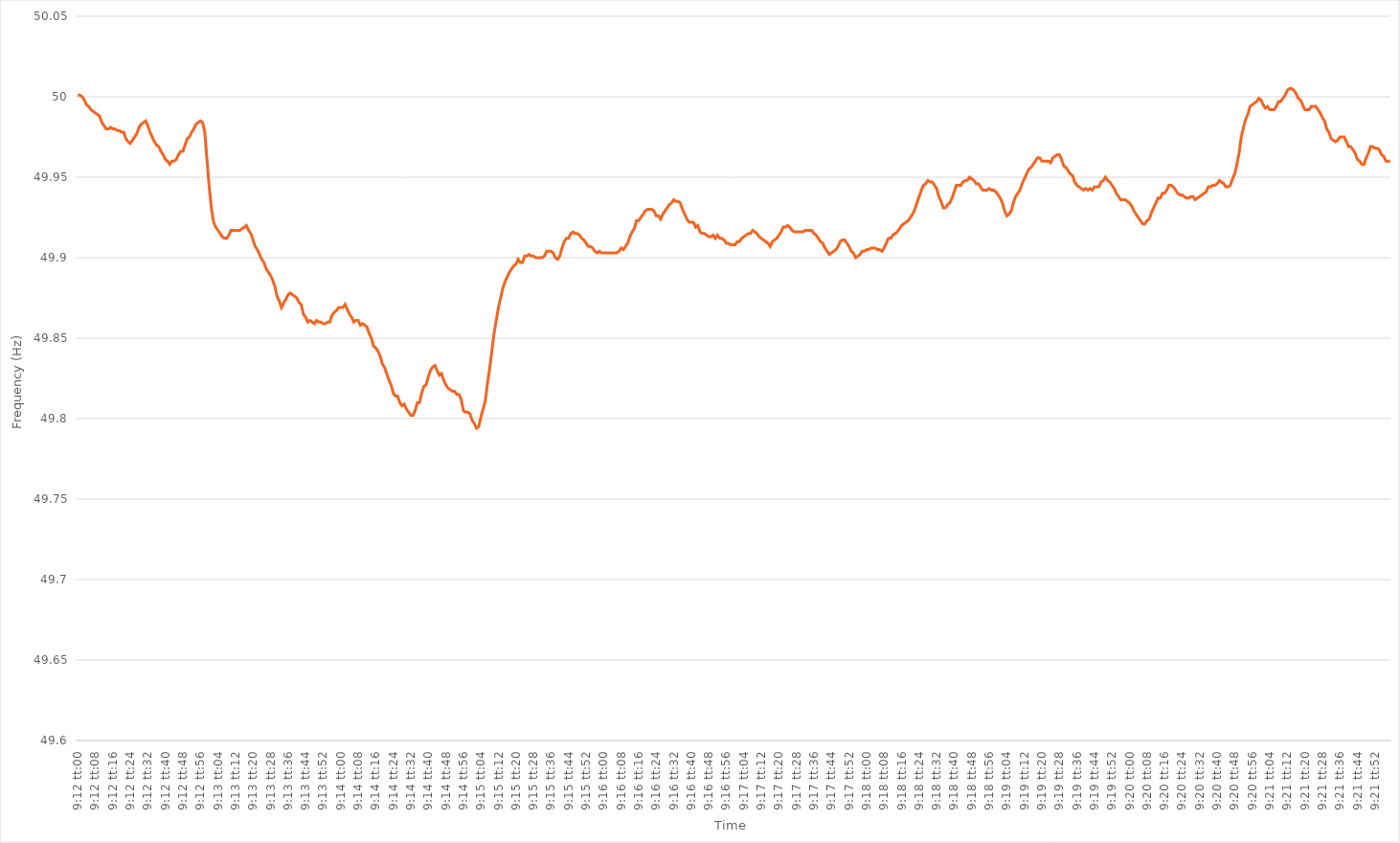
| Category | Series 0 |
|---|---|
| 0.3833333333333333 | 50.001 |
| 0.3833449074074074 | 50.001 |
| 0.38335648148148144 | 50 |
| 0.3833680555555556 | 49.998 |
| 0.3833796296296296 | 49.995 |
| 0.3833912037037037 | 49.994 |
| 0.38340277777777776 | 49.992 |
| 0.38341435185185185 | 49.991 |
| 0.3834259259259259 | 49.99 |
| 0.38343750000000004 | 49.989 |
| 0.3834490740740741 | 49.988 |
| 0.3834606481481482 | 49.984 |
| 0.3834722222222222 | 49.982 |
| 0.3834837962962963 | 49.98 |
| 0.38349537037037035 | 49.98 |
| 0.3835069444444445 | 49.981 |
| 0.38351851851851854 | 49.98 |
| 0.3835300925925926 | 49.98 |
| 0.38354166666666667 | 49.979 |
| 0.3835532407407407 | 49.979 |
| 0.3835648148148148 | 49.978 |
| 0.38357638888888884 | 49.978 |
| 0.383587962962963 | 49.974 |
| 0.38359953703703703 | 49.972 |
| 0.3836111111111111 | 49.971 |
| 0.38362268518518516 | 49.973 |
| 0.38363425925925926 | 49.975 |
| 0.3836458333333333 | 49.977 |
| 0.38365740740740745 | 49.981 |
| 0.3836689814814815 | 49.983 |
| 0.3836805555555556 | 49.984 |
| 0.3836921296296296 | 49.985 |
| 0.3837037037037037 | 49.982 |
| 0.38371527777777775 | 49.978 |
| 0.3837268518518519 | 49.975 |
| 0.38373842592592594 | 49.972 |
| 0.38375000000000004 | 49.97 |
| 0.3837615740740741 | 49.969 |
| 0.3837731481481481 | 49.966 |
| 0.3837847222222222 | 49.964 |
| 0.38379629629629625 | 49.961 |
| 0.3838078703703704 | 49.96 |
| 0.38381944444444444 | 49.958 |
| 0.38383101851851853 | 49.96 |
| 0.38384259259259257 | 49.96 |
| 0.38385416666666666 | 49.961 |
| 0.3838657407407407 | 49.964 |
| 0.38387731481481485 | 49.966 |
| 0.3838888888888889 | 49.966 |
| 0.383900462962963 | 49.97 |
| 0.383912037037037 | 49.974 |
| 0.3839236111111111 | 49.975 |
| 0.38393518518518516 | 49.978 |
| 0.3839467592592593 | 49.98 |
| 0.38395833333333335 | 49.983 |
| 0.38396990740740744 | 49.984 |
| 0.3839814814814815 | 49.985 |
| 0.3839930555555555 | 49.984 |
| 0.3840046296296296 | 49.978 |
| 0.38401620370370365 | 49.961 |
| 0.3840277777777778 | 49.944 |
| 0.38403935185185184 | 49.931 |
| 0.38405092592592593 | 49.922 |
| 0.3840625 | 49.919 |
| 0.38407407407407407 | 49.917 |
| 0.3840856481481481 | 49.915 |
| 0.38409722222222226 | 49.913 |
| 0.3841087962962963 | 49.912 |
| 0.3841203703703704 | 49.912 |
| 0.38413194444444443 | 49.914 |
| 0.3841435185185185 | 49.917 |
| 0.38415509259259256 | 49.917 |
| 0.3841666666666667 | 49.917 |
| 0.38417824074074075 | 49.917 |
| 0.38418981481481485 | 49.917 |
| 0.3842013888888889 | 49.918 |
| 0.384212962962963 | 49.919 |
| 0.384224537037037 | 49.92 |
| 0.38423611111111117 | 49.917 |
| 0.3842476851851852 | 49.915 |
| 0.38425925925925924 | 49.911 |
| 0.38427083333333334 | 49.907 |
| 0.3842824074074074 | 49.905 |
| 0.3842939814814815 | 49.902 |
| 0.3843055555555555 | 49.899 |
| 0.38431712962962966 | 49.897 |
| 0.3843287037037037 | 49.893 |
| 0.3843402777777778 | 49.891 |
| 0.38435185185185183 | 49.889 |
| 0.38436342592592593 | 49.886 |
| 0.38437499999999997 | 49.882 |
| 0.3843865740740741 | 49.876 |
| 0.38439814814814816 | 49.873 |
| 0.38440972222222225 | 49.869 |
| 0.3844212962962963 | 49.872 |
| 0.3844328703703704 | 49.874 |
| 0.3844444444444444 | 49.877 |
| 0.38445601851851857 | 49.878 |
| 0.3844675925925926 | 49.877 |
| 0.38447916666666665 | 49.876 |
| 0.38449074074074074 | 49.875 |
| 0.3845023148148148 | 49.872 |
| 0.3845138888888889 | 49.871 |
| 0.3845254629629629 | 49.865 |
| 0.38453703703703707 | 49.863 |
| 0.3845486111111111 | 49.86 |
| 0.3845601851851852 | 49.861 |
| 0.38457175925925924 | 49.86 |
| 0.38458333333333333 | 49.859 |
| 0.38459490740740737 | 49.861 |
| 0.3846064814814815 | 49.86 |
| 0.38461805555555556 | 49.86 |
| 0.38462962962962965 | 49.859 |
| 0.3846412037037037 | 49.859 |
| 0.3846527777777778 | 49.86 |
| 0.3846643518518518 | 49.86 |
| 0.384675925925926 | 49.864 |
| 0.3846875 | 49.866 |
| 0.3846990740740741 | 49.867 |
| 0.38471064814814815 | 49.869 |
| 0.3847222222222222 | 49.869 |
| 0.3847337962962963 | 49.869 |
| 0.3847453703703703 | 49.871 |
| 0.38475694444444447 | 49.868 |
| 0.3847685185185185 | 49.865 |
| 0.3847800925925926 | 49.863 |
| 0.38479166666666664 | 49.86 |
| 0.38480324074074074 | 49.861 |
| 0.3848148148148148 | 49.861 |
| 0.3848263888888889 | 49.858 |
| 0.38483796296296297 | 49.859 |
| 0.38484953703703706 | 49.858 |
| 0.3848611111111111 | 49.857 |
| 0.3848726851851852 | 49.853 |
| 0.38488425925925923 | 49.85 |
| 0.3848958333333334 | 49.845 |
| 0.3849074074074074 | 49.844 |
| 0.3849189814814815 | 49.842 |
| 0.38493055555555555 | 49.839 |
| 0.38494212962962965 | 49.834 |
| 0.3849537037037037 | 49.832 |
| 0.3849652777777777 | 49.828 |
| 0.3849768518518519 | 49.824 |
| 0.3849884259259259 | 49.821 |
| 0.385 | 49.816 |
| 0.38501157407407405 | 49.814 |
| 0.38502314814814814 | 49.814 |
| 0.3850347222222222 | 49.81 |
| 0.38504629629629633 | 49.808 |
| 0.38505787037037037 | 49.809 |
| 0.38506944444444446 | 49.806 |
| 0.3850810185185185 | 49.804 |
| 0.3850925925925926 | 49.802 |
| 0.38510416666666664 | 49.802 |
| 0.3851157407407408 | 49.805 |
| 0.3851273148148148 | 49.81 |
| 0.3851388888888889 | 49.81 |
| 0.38515046296296296 | 49.816 |
| 0.38516203703703705 | 49.82 |
| 0.3851736111111111 | 49.821 |
| 0.38518518518518513 | 49.826 |
| 0.3851967592592593 | 49.83 |
| 0.3852083333333333 | 49.832 |
| 0.3852199074074074 | 49.833 |
| 0.38523148148148145 | 49.83 |
| 0.38524305555555555 | 49.827 |
| 0.3852546296296296 | 49.828 |
| 0.38526620370370374 | 49.824 |
| 0.3852777777777778 | 49.821 |
| 0.38528935185185187 | 49.819 |
| 0.3853009259259259 | 49.818 |
| 0.3853125 | 49.817 |
| 0.38532407407407404 | 49.817 |
| 0.3853356481481482 | 49.815 |
| 0.38534722222222223 | 49.815 |
| 0.3853587962962963 | 49.812 |
| 0.38537037037037036 | 49.805 |
| 0.38538194444444446 | 49.804 |
| 0.3853935185185185 | 49.804 |
| 0.38540509259259265 | 49.803 |
| 0.3854166666666667 | 49.799 |
| 0.3854282407407407 | 49.797 |
| 0.3854398148148148 | 49.794 |
| 0.38545138888888886 | 49.795 |
| 0.38546296296296295 | 49.801 |
| 0.385474537037037 | 49.806 |
| 0.38548611111111114 | 49.811 |
| 0.3854976851851852 | 49.822 |
| 0.3855092592592593 | 49.831 |
| 0.3855208333333333 | 49.842 |
| 0.3855324074074074 | 49.853 |
| 0.38554398148148145 | 49.861 |
| 0.3855555555555556 | 49.869 |
| 0.38556712962962963 | 49.875 |
| 0.38557870370370373 | 49.881 |
| 0.38559027777777777 | 49.885 |
| 0.38560185185185186 | 49.888 |
| 0.3856134259259259 | 49.891 |
| 0.38562500000000005 | 49.893 |
| 0.3856365740740741 | 49.895 |
| 0.3856481481481482 | 49.896 |
| 0.3856597222222222 | 49.899 |
| 0.38567129629629626 | 49.897 |
| 0.38568287037037036 | 49.897 |
| 0.3856944444444444 | 49.901 |
| 0.38570601851851855 | 49.901 |
| 0.3857175925925926 | 49.902 |
| 0.3857291666666667 | 49.901 |
| 0.3857407407407407 | 49.901 |
| 0.3857523148148148 | 49.9 |
| 0.38576388888888885 | 49.9 |
| 0.385775462962963 | 49.9 |
| 0.38578703703703704 | 49.9 |
| 0.38579861111111113 | 49.901 |
| 0.3858101851851852 | 49.904 |
| 0.38582175925925927 | 49.904 |
| 0.3858333333333333 | 49.904 |
| 0.38584490740740746 | 49.903 |
| 0.3858564814814815 | 49.9 |
| 0.3858680555555556 | 49.899 |
| 0.38587962962962963 | 49.901 |
| 0.38589120370370367 | 49.906 |
| 0.38590277777777776 | 49.91 |
| 0.3859143518518518 | 49.912 |
| 0.38592592592592595 | 49.912 |
| 0.3859375 | 49.915 |
| 0.3859490740740741 | 49.916 |
| 0.3859606481481481 | 49.915 |
| 0.3859722222222222 | 49.915 |
| 0.38598379629629626 | 49.914 |
| 0.3859953703703704 | 49.912 |
| 0.38600694444444444 | 49.911 |
| 0.38601851851851854 | 49.909 |
| 0.3860300925925926 | 49.907 |
| 0.38604166666666667 | 49.907 |
| 0.3860532407407407 | 49.906 |
| 0.38606481481481486 | 49.904 |
| 0.3860763888888889 | 49.903 |
| 0.386087962962963 | 49.904 |
| 0.38609953703703703 | 49.903 |
| 0.3861111111111111 | 49.903 |
| 0.38612268518518517 | 49.903 |
| 0.3861342592592593 | 49.903 |
| 0.38614583333333335 | 49.903 |
| 0.3861574074074074 | 49.903 |
| 0.3861689814814815 | 49.903 |
| 0.3861805555555555 | 49.903 |
| 0.3861921296296296 | 49.904 |
| 0.38620370370370366 | 49.906 |
| 0.3862152777777778 | 49.905 |
| 0.38622685185185185 | 49.907 |
| 0.38623842592592594 | 49.909 |
| 0.38625 | 49.913 |
| 0.3862615740740741 | 49.916 |
| 0.3862731481481481 | 49.918 |
| 0.38628472222222227 | 49.923 |
| 0.3862962962962963 | 49.923 |
| 0.3863078703703704 | 49.925 |
| 0.38631944444444444 | 49.927 |
| 0.38633101851851853 | 49.929 |
| 0.38634259259259257 | 49.93 |
| 0.3863541666666667 | 49.93 |
| 0.38636574074074076 | 49.93 |
| 0.3863773148148148 | 49.929 |
| 0.3863888888888889 | 49.926 |
| 0.38640046296296293 | 49.926 |
| 0.386412037037037 | 49.924 |
| 0.38642361111111106 | 49.927 |
| 0.3864351851851852 | 49.929 |
| 0.38644675925925925 | 49.931 |
| 0.38645833333333335 | 49.933 |
| 0.3864699074074074 | 49.934 |
| 0.3864814814814815 | 49.936 |
| 0.3864930555555555 | 49.935 |
| 0.38650462962962967 | 49.935 |
| 0.3865162037037037 | 49.934 |
| 0.3865277777777778 | 49.93 |
| 0.38653935185185184 | 49.927 |
| 0.38655092592592594 | 49.924 |
| 0.3865625 | 49.922 |
| 0.3865740740740741 | 49.922 |
| 0.38658564814814816 | 49.922 |
| 0.3865972222222222 | 49.919 |
| 0.3866087962962963 | 49.92 |
| 0.38662037037037034 | 49.916 |
| 0.38663194444444443 | 49.915 |
| 0.38664351851851847 | 49.915 |
| 0.3866550925925926 | 49.914 |
| 0.38666666666666666 | 49.913 |
| 0.38667824074074075 | 49.913 |
| 0.3866898148148148 | 49.914 |
| 0.3867013888888889 | 49.912 |
| 0.3867129629629629 | 49.914 |
| 0.3867245370370371 | 49.912 |
| 0.3867361111111111 | 49.912 |
| 0.3867476851851852 | 49.911 |
| 0.38675925925925925 | 49.909 |
| 0.38677083333333334 | 49.909 |
| 0.3867824074074074 | 49.908 |
| 0.38679398148148153 | 49.908 |
| 0.38680555555555557 | 49.908 |
| 0.38681712962962966 | 49.91 |
| 0.3868287037037037 | 49.91 |
| 0.3868402777777778 | 49.912 |
| 0.38685185185185184 | 49.913 |
| 0.3868634259259259 | 49.914 |
| 0.386875 | 49.915 |
| 0.38688657407407406 | 49.915 |
| 0.38689814814814816 | 49.917 |
| 0.3869097222222222 | 49.916 |
| 0.3869212962962963 | 49.915 |
| 0.38693287037037033 | 49.913 |
| 0.3869444444444445 | 49.912 |
| 0.3869560185185185 | 49.911 |
| 0.3869675925925926 | 49.91 |
| 0.38697916666666665 | 49.909 |
| 0.38699074074074075 | 49.907 |
| 0.3870023148148148 | 49.91 |
| 0.38701388888888894 | 49.911 |
| 0.387025462962963 | 49.912 |
| 0.38703703703703707 | 49.914 |
| 0.3870486111111111 | 49.916 |
| 0.3870601851851852 | 49.919 |
| 0.38707175925925924 | 49.919 |
| 0.3870833333333333 | 49.92 |
| 0.38709490740740743 | 49.919 |
| 0.38710648148148147 | 49.917 |
| 0.38711805555555556 | 49.916 |
| 0.3871296296296296 | 49.916 |
| 0.3871412037037037 | 49.916 |
| 0.38715277777777773 | 49.916 |
| 0.3871643518518519 | 49.916 |
| 0.3871759259259259 | 49.917 |
| 0.3871875 | 49.917 |
| 0.38719907407407406 | 49.917 |
| 0.38721064814814815 | 49.917 |
| 0.3872222222222222 | 49.915 |
| 0.38723379629629634 | 49.914 |
| 0.3872453703703704 | 49.912 |
| 0.3872569444444445 | 49.91 |
| 0.3872685185185185 | 49.909 |
| 0.3872800925925926 | 49.906 |
| 0.38729166666666665 | 49.904 |
| 0.3873032407407407 | 49.902 |
| 0.38731481481481483 | 49.903 |
| 0.3873263888888889 | 49.904 |
| 0.38733796296296297 | 49.905 |
| 0.387349537037037 | 49.907 |
| 0.3873611111111111 | 49.91 |
| 0.38737268518518514 | 49.911 |
| 0.3873842592592593 | 49.911 |
| 0.38739583333333333 | 49.909 |
| 0.3874074074074074 | 49.907 |
| 0.38741898148148146 | 49.904 |
| 0.38743055555555556 | 49.903 |
| 0.3874421296296296 | 49.9 |
| 0.38745370370370374 | 49.901 |
| 0.3874652777777778 | 49.902 |
| 0.3874768518518519 | 49.904 |
| 0.3874884259259259 | 49.904 |
| 0.3875 | 49.905 |
| 0.38751157407407405 | 49.905 |
| 0.3875231481481482 | 49.906 |
| 0.38753472222222224 | 49.906 |
| 0.38754629629629633 | 49.906 |
| 0.38755787037037037 | 49.905 |
| 0.3875694444444444 | 49.905 |
| 0.3875810185185185 | 49.904 |
| 0.38759259259259254 | 49.906 |
| 0.3876041666666667 | 49.909 |
| 0.38761574074074073 | 49.912 |
| 0.3876273148148148 | 49.912 |
| 0.38763888888888887 | 49.914 |
| 0.38765046296296296 | 49.915 |
| 0.387662037037037 | 49.916 |
| 0.38767361111111115 | 49.918 |
| 0.3876851851851852 | 49.92 |
| 0.3876967592592593 | 49.921 |
| 0.3877083333333333 | 49.922 |
| 0.3877199074074074 | 49.923 |
| 0.38773148148148145 | 49.925 |
| 0.3877430555555556 | 49.927 |
| 0.38775462962962964 | 49.93 |
| 0.38776620370370374 | 49.934 |
| 0.3877777777777778 | 49.938 |
| 0.3877893518518518 | 49.942 |
| 0.3878009259259259 | 49.945 |
| 0.38781249999999995 | 49.946 |
| 0.3878240740740741 | 49.948 |
| 0.38783564814814814 | 49.947 |
| 0.38784722222222223 | 49.947 |
| 0.38785879629629627 | 49.945 |
| 0.38787037037037037 | 49.943 |
| 0.3878819444444444 | 49.938 |
| 0.38789351851851855 | 49.935 |
| 0.3879050925925926 | 49.931 |
| 0.3879166666666667 | 49.931 |
| 0.3879282407407407 | 49.933 |
| 0.3879398148148148 | 49.934 |
| 0.38795138888888886 | 49.937 |
| 0.387962962962963 | 49.941 |
| 0.38797453703703705 | 49.945 |
| 0.38798611111111114 | 49.945 |
| 0.3879976851851852 | 49.945 |
| 0.3880092592592593 | 49.947 |
| 0.3880208333333333 | 49.948 |
| 0.38803240740740735 | 49.948 |
| 0.3880439814814815 | 49.95 |
| 0.38805555555555554 | 49.949 |
| 0.38806712962962964 | 49.948 |
| 0.3880787037037037 | 49.946 |
| 0.38809027777777777 | 49.946 |
| 0.3881018518518518 | 49.944 |
| 0.38811342592592596 | 49.942 |
| 0.388125 | 49.942 |
| 0.3881365740740741 | 49.942 |
| 0.38814814814814813 | 49.943 |
| 0.3881597222222222 | 49.942 |
| 0.38817129629629626 | 49.942 |
| 0.3881828703703704 | 49.941 |
| 0.38819444444444445 | 49.939 |
| 0.38820601851851855 | 49.937 |
| 0.3882175925925926 | 49.934 |
| 0.3882291666666667 | 49.929 |
| 0.3882407407407407 | 49.926 |
| 0.38825231481481487 | 49.927 |
| 0.3882638888888889 | 49.929 |
| 0.38827546296296295 | 49.934 |
| 0.38828703703703704 | 49.938 |
| 0.3882986111111111 | 49.94 |
| 0.3883101851851852 | 49.942 |
| 0.3883217592592592 | 49.946 |
| 0.38833333333333336 | 49.949 |
| 0.3883449074074074 | 49.952 |
| 0.3883564814814815 | 49.955 |
| 0.38836805555555554 | 49.956 |
| 0.38837962962962963 | 49.958 |
| 0.38839120370370367 | 49.96 |
| 0.3884027777777778 | 49.962 |
| 0.38841435185185186 | 49.962 |
| 0.38842592592592595 | 49.96 |
| 0.3884375 | 49.96 |
| 0.3884490740740741 | 49.96 |
| 0.3884606481481481 | 49.96 |
| 0.3884722222222223 | 49.959 |
| 0.3884837962962963 | 49.962 |
| 0.38849537037037035 | 49.963 |
| 0.38850694444444445 | 49.964 |
| 0.3885185185185185 | 49.964 |
| 0.3885300925925926 | 49.961 |
| 0.3885416666666666 | 49.957 |
| 0.38855324074074077 | 49.956 |
| 0.3885648148148148 | 49.954 |
| 0.3885763888888889 | 49.952 |
| 0.38858796296296294 | 49.951 |
| 0.38859953703703703 | 49.947 |
| 0.3886111111111111 | 49.945 |
| 0.3886226851851852 | 49.944 |
| 0.38863425925925926 | 49.943 |
| 0.38864583333333336 | 49.942 |
| 0.3886574074074074 | 49.943 |
| 0.3886689814814815 | 49.942 |
| 0.38868055555555553 | 49.943 |
| 0.3886921296296297 | 49.942 |
| 0.3887037037037037 | 49.944 |
| 0.3887152777777778 | 49.944 |
| 0.38872685185185185 | 49.944 |
| 0.38873842592592595 | 49.947 |
| 0.38875 | 49.948 |
| 0.388761574074074 | 49.95 |
| 0.3887731481481482 | 49.948 |
| 0.3887847222222222 | 49.947 |
| 0.3887962962962963 | 49.945 |
| 0.38880787037037035 | 49.943 |
| 0.38881944444444444 | 49.94 |
| 0.3888310185185185 | 49.938 |
| 0.38884259259259263 | 49.936 |
| 0.38885416666666667 | 49.936 |
| 0.38886574074074076 | 49.936 |
| 0.3888773148148148 | 49.935 |
| 0.3888888888888889 | 49.934 |
| 0.38890046296296293 | 49.932 |
| 0.3889120370370371 | 49.929 |
| 0.3889236111111111 | 49.927 |
| 0.3889351851851852 | 49.925 |
| 0.38894675925925926 | 49.923 |
| 0.38895833333333335 | 49.921 |
| 0.3889699074074074 | 49.921 |
| 0.38898148148148143 | 49.923 |
| 0.3889930555555556 | 49.924 |
| 0.3890046296296296 | 49.928 |
| 0.3890162037037037 | 49.931 |
| 0.38902777777777775 | 49.934 |
| 0.38903935185185184 | 49.937 |
| 0.3890509259259259 | 49.937 |
| 0.38906250000000003 | 49.94 |
| 0.38907407407407407 | 49.94 |
| 0.38908564814814817 | 49.942 |
| 0.3890972222222222 | 49.945 |
| 0.3891087962962963 | 49.945 |
| 0.38912037037037034 | 49.944 |
| 0.3891319444444445 | 49.942 |
| 0.3891435185185185 | 49.94 |
| 0.3891550925925926 | 49.939 |
| 0.38916666666666666 | 49.939 |
| 0.38917824074074076 | 49.938 |
| 0.3891898148148148 | 49.937 |
| 0.38920138888888883 | 49.937 |
| 0.389212962962963 | 49.938 |
| 0.389224537037037 | 49.938 |
| 0.3892361111111111 | 49.936 |
| 0.38924768518518515 | 49.937 |
| 0.38925925925925925 | 49.938 |
| 0.3892708333333333 | 49.939 |
| 0.38928240740740744 | 49.94 |
| 0.3892939814814815 | 49.941 |
| 0.38930555555555557 | 49.944 |
| 0.3893171296296296 | 49.944 |
| 0.3893287037037037 | 49.945 |
| 0.38934027777777774 | 49.945 |
| 0.3893518518518519 | 49.946 |
| 0.38936342592592593 | 49.948 |
| 0.389375 | 49.947 |
| 0.38938657407407407 | 49.946 |
| 0.38939814814814816 | 49.944 |
| 0.3894097222222222 | 49.944 |
| 0.38942129629629635 | 49.945 |
| 0.3894328703703704 | 49.949 |
| 0.3894444444444445 | 49.952 |
| 0.3894560185185185 | 49.958 |
| 0.38946759259259256 | 49.965 |
| 0.38947916666666665 | 49.975 |
| 0.3894907407407407 | 49.981 |
| 0.38950231481481484 | 49.986 |
| 0.3895138888888889 | 49.989 |
| 0.389525462962963 | 49.994 |
| 0.389537037037037 | 49.995 |
| 0.3895486111111111 | 49.996 |
| 0.38956018518518515 | 49.997 |
| 0.3895717592592593 | 49.999 |
| 0.38958333333333334 | 49.998 |
| 0.38959490740740743 | 49.995 |
| 0.38960648148148147 | 49.993 |
| 0.38961805555555556 | 49.994 |
| 0.3896296296296296 | 49.992 |
| 0.38964120370370375 | 49.992 |
| 0.3896527777777778 | 49.992 |
| 0.3896643518518519 | 49.994 |
| 0.3896759259259259 | 49.997 |
| 0.38968749999999996 | 49.997 |
| 0.38969907407407406 | 49.999 |
| 0.3897106481481481 | 50.001 |
| 0.38972222222222225 | 50.004 |
| 0.3897337962962963 | 50.005 |
| 0.3897453703703704 | 50.005 |
| 0.3897569444444444 | 50.004 |
| 0.3897685185185185 | 50.002 |
| 0.38978009259259255 | 49.999 |
| 0.3897916666666667 | 49.998 |
| 0.38980324074074074 | 49.995 |
| 0.38981481481481484 | 49.992 |
| 0.3898263888888889 | 49.992 |
| 0.38983796296296297 | 49.992 |
| 0.389849537037037 | 49.994 |
| 0.38986111111111116 | 49.994 |
| 0.3898726851851852 | 49.994 |
| 0.3898842592592593 | 49.992 |
| 0.38989583333333333 | 49.99 |
| 0.38990740740740737 | 49.987 |
| 0.38991898148148146 | 49.985 |
| 0.3899305555555555 | 49.98 |
| 0.38994212962962965 | 49.978 |
| 0.3899537037037037 | 49.974 |
| 0.3899652777777778 | 49.973 |
| 0.3899768518518518 | 49.972 |
| 0.3899884259259259 | 49.973 |
| 0.38999999999999996 | 49.975 |
| 0.3900115740740741 | 49.975 |
| 0.39002314814814815 | 49.975 |
| 0.39003472222222224 | 49.972 |
| 0.3900462962962963 | 49.969 |
| 0.3900578703703704 | 49.969 |
| 0.3900694444444444 | 49.967 |
| 0.39008101851851856 | 49.965 |
| 0.3900925925925926 | 49.961 |
| 0.3901041666666667 | 49.96 |
| 0.39011574074074074 | 49.958 |
| 0.39012731481481483 | 49.958 |
| 0.39013888888888887 | 49.962 |
| 0.390150462962963 | 49.965 |
| 0.39016203703703706 | 49.969 |
| 0.3901736111111111 | 49.969 |
| 0.3901851851851852 | 49.968 |
| 0.39019675925925923 | 49.968 |
| 0.3902083333333333 | 49.967 |
| 0.39021990740740736 | 49.964 |
| 0.3902314814814815 | 49.963 |
| 0.39024305555555555 | 49.96 |
| 0.39025462962962965 | 49.96 |
| 0.3902662037037037 | 49.96 |